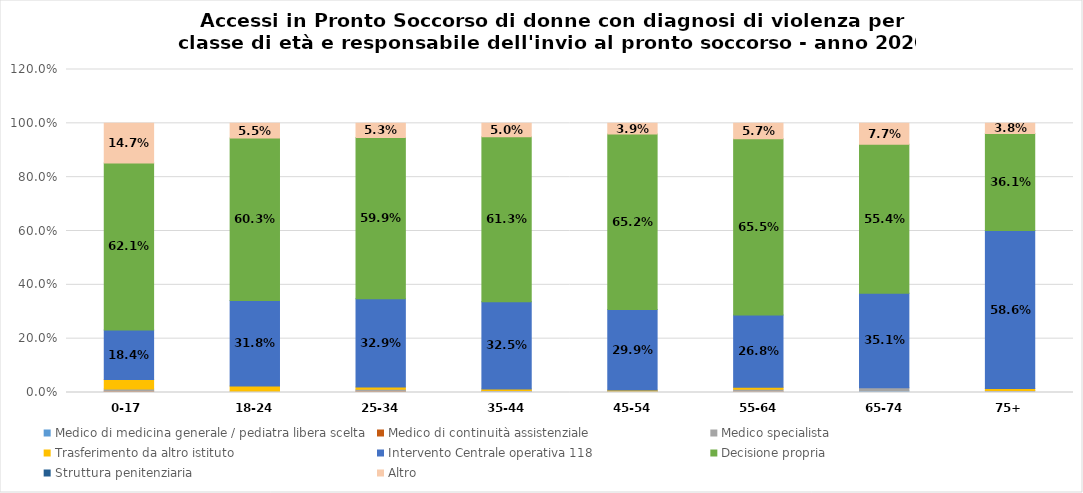
| Category | Medico di medicina generale / pediatra libera scelta | Medico di continuità assistenziale | Medico specialista | Trasferimento da altro istituto | Intervento Centrale operativa 118 | Decisione propria | Struttura penitenziaria | Altro |
|---|---|---|---|---|---|---|---|---|
| 0-17 | 0.003 | 0.003 | 0.007 | 0.036 | 0.184 | 0.621 | 0 | 0.147 |
| 18-24 | 0 | 0 | 0.004 | 0.02 | 0.318 | 0.603 | 0 | 0.055 |
| 25-34 | 0.002 | 0.004 | 0.007 | 0.008 | 0.329 | 0.599 | 0 | 0.053 |
| 35-44 | 0.002 | 0.002 | 0.004 | 0.005 | 0.325 | 0.613 | 0 | 0.05 |
| 45-54 | 0.002 | 0.001 | 0.002 | 0.004 | 0.299 | 0.652 | 0 | 0.039 |
| 55-64 | 0 | 0.005 | 0.007 | 0.007 | 0.268 | 0.655 | 0 | 0.057 |
| 65-74 | 0.006 | 0 | 0.012 | 0 | 0.351 | 0.554 | 0 | 0.077 |
| 75+ | 0 | 0 | 0.008 | 0.008 | 0.586 | 0.361 | 0 | 0.038 |